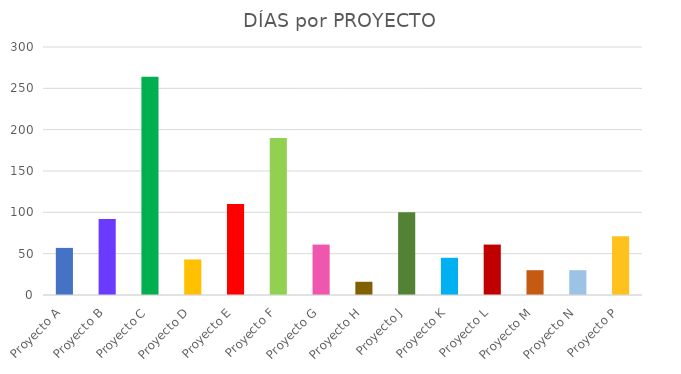
| Category | CANT. DE DÍAS |
|---|---|
| Proyecto A | 57 |
| Proyecto B | 92 |
| Proyecto C | 264 |
| Proyecto D | 43 |
| Proyecto E | 110 |
| Proyecto F | 190 |
| Proyecto G | 61 |
| Proyecto H | 16 |
| Proyecto J | 100 |
| Proyecto K | 45 |
| Proyecto L | 61 |
| Proyecto M | 30 |
| Proyecto N | 30 |
| Proyecto P | 71 |